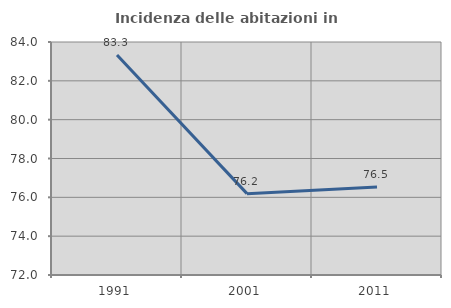
| Category | Incidenza delle abitazioni in proprietà  |
|---|---|
| 1991.0 | 83.333 |
| 2001.0 | 76.19 |
| 2011.0 | 76.538 |